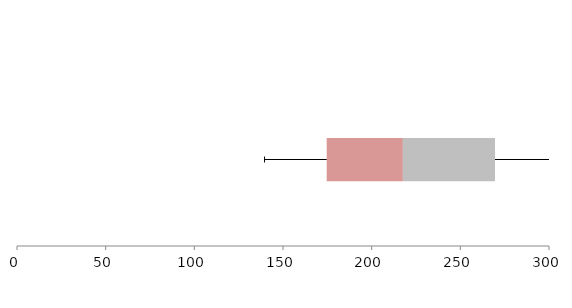
| Category | Series 1 | Series 2 | Series 3 |
|---|---|---|---|
| 0 | 174.647 | 42.947 | 51.954 |